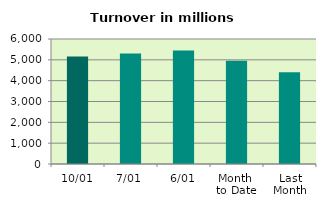
| Category | Series 0 |
|---|---|
| 10/01 | 5161.058 |
| 7/01 | 5304.967 |
| 6/01 | 5447.71 |
| Month 
to Date | 4956.494 |
| Last
Month | 4407.558 |